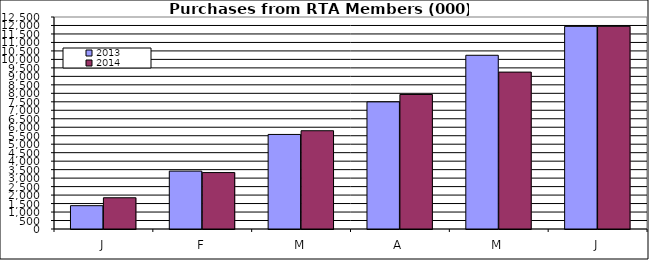
| Category | 2013 | 2014 |
|---|---|---|
| J | 1375.298 | 1842.078 |
| F | 3413.689 | 3327.055 |
| M | 5575.07 | 5794.828 |
| A | 7495.041 | 7931.408 |
| M | 10243.35 | 9251.089 |
| J | 11948.593 | 11950.353 |